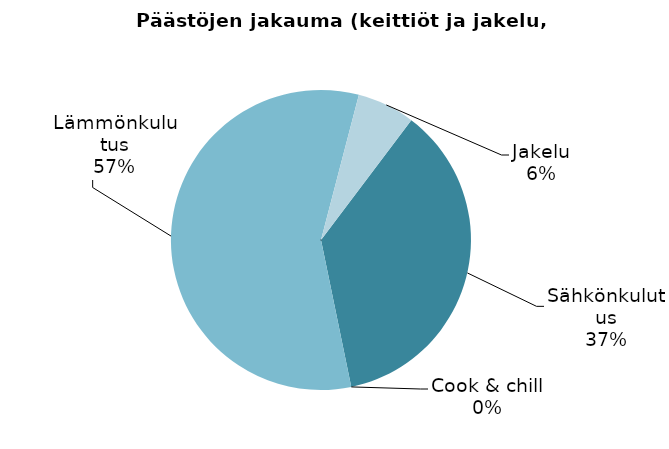
| Category | Series 0 |
|---|---|
| Sähkönkulutus | 33.348 |
| Cook & chill | 0 |
| Lämmönkulutus | 52.37 |
| Jakelu | 5.678 |